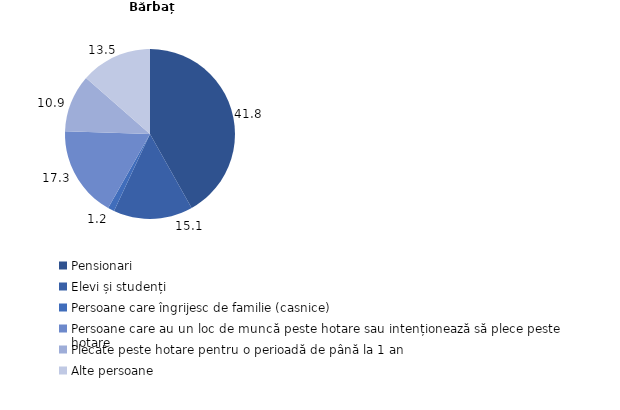
| Category | Bărbați |
|---|---|
| Pensionari | 41.847 |
| Elevi și studenți | 15.11 |
| Persoane care îngrijesc de familie (casnice) | 1.243 |
| Persoane care au un loc de muncă peste hotare sau intenționează să plece peste hotare | 17.335 |
| Plecate peste hotare pentru o perioadă de până la 1 an | 10.915 |
| Alte persoane | 13.55 |